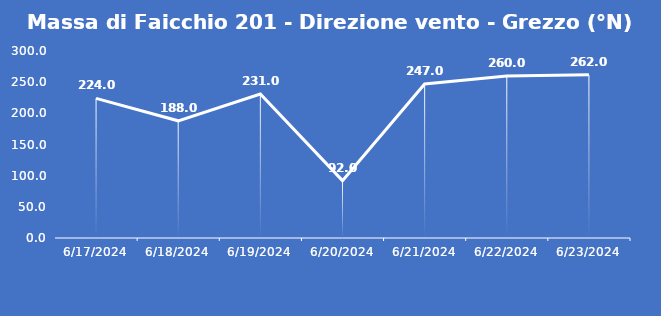
| Category | Massa di Faicchio 201 - Direzione vento - Grezzo (°N) |
|---|---|
| 6/17/24 | 224 |
| 6/18/24 | 188 |
| 6/19/24 | 231 |
| 6/20/24 | 92 |
| 6/21/24 | 247 |
| 6/22/24 | 260 |
| 6/23/24 | 262 |